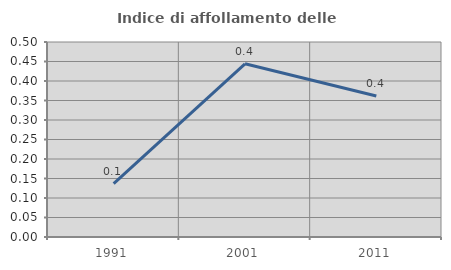
| Category | Indice di affollamento delle abitazioni  |
|---|---|
| 1991.0 | 0.137 |
| 2001.0 | 0.444 |
| 2011.0 | 0.362 |